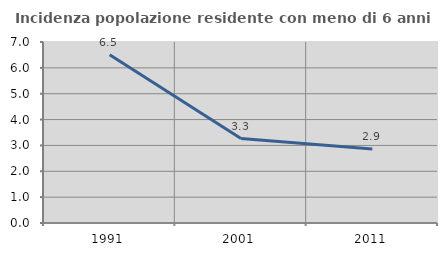
| Category | Incidenza popolazione residente con meno di 6 anni |
|---|---|
| 1991.0 | 6.504 |
| 2001.0 | 3.265 |
| 2011.0 | 2.865 |